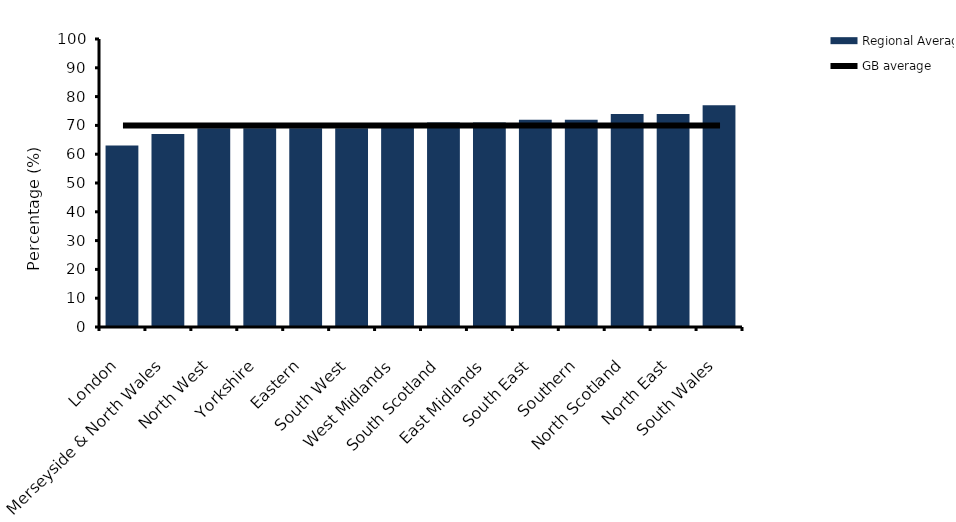
| Category | Regional Average |
|---|---|
| London | 63 |
| Merseyside & North Wales | 67 |
| North West | 69 |
| Yorkshire | 69 |
| Eastern | 69 |
| South West | 69 |
| West Midlands | 70 |
| South Scotland | 71 |
| East Midlands | 71 |
| South East | 72 |
| Southern | 72 |
| North Scotland | 74 |
| North East | 74 |
| South Wales | 77 |